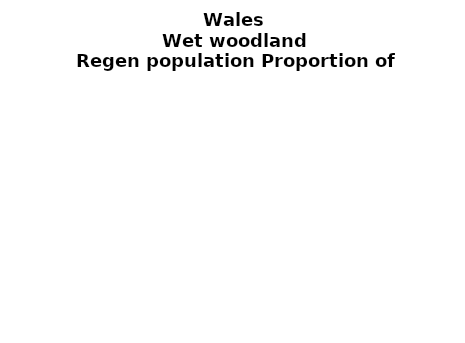
| Category | Wet woodland |
|---|---|
| None | 0.031 |
| Seedlings only | 0 |
| Seedlings, saplings only | 0.011 |
| Seedlings, saplings, <7 cm trees | 0.167 |
| Saplings only | 0.087 |
| <7 cm trees, seedlings only | 0 |
| <7 cm trees, saplings only | 0.643 |
| <7 cm Trees only | 0.059 |